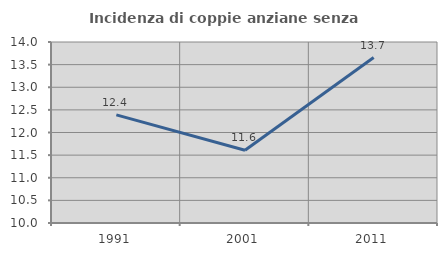
| Category | Incidenza di coppie anziane senza figli  |
|---|---|
| 1991.0 | 12.389 |
| 2001.0 | 11.607 |
| 2011.0 | 13.656 |